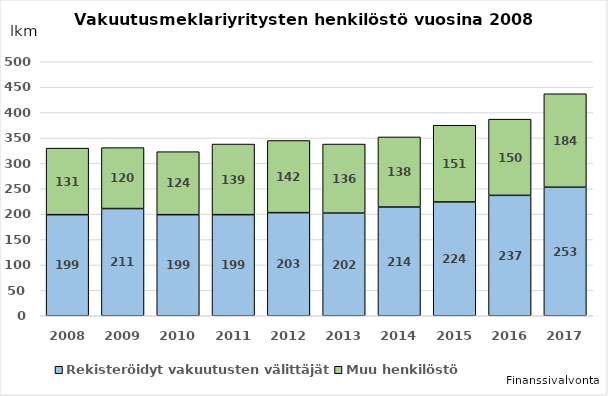
| Category | Rekisteröidyt vakuutusten välittäjät  | Muu henkilöstö |
|---|---|---|
| 2008.0 | 199 | 131 |
| 2009.0 | 211 | 120 |
| 2010.0 | 199 | 124 |
| 2011.0 | 199 | 139 |
| 2012.0 | 203 | 142 |
| 2013.0 | 202 | 136 |
| 2014.0 | 214 | 138 |
| 2015.0 | 224 | 151 |
| 2016.0 | 237 | 150 |
| 2017.0 | 253 | 184 |